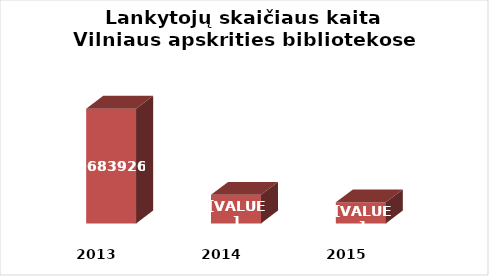
| Category | Series 0 |
|---|---|
| 2013.0 | 1683926 |
| 2014.0 | 1620918 |
| 2015.0 | 1615448 |